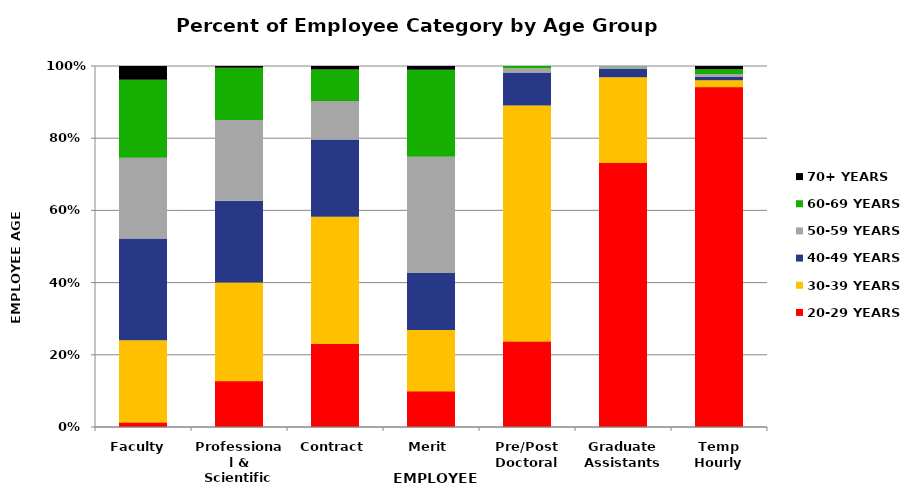
| Category | 20-29 YEARS | 30-39 YEARS | 40-49 YEARS | 50-59 YEARS | 60-69 YEARS | 70+ YEARS |
|---|---|---|---|---|---|---|
| Faculty  | 0.014 | 0.226 | 0.282 | 0.224 | 0.216 | 0.038 |
| Professional & Scientific | 0.13 | 0.27 | 0.227 | 0.224 | 0.144 | 0.005 |
| Contract | 0.233 | 0.35 | 0.214 | 0.107 | 0.087 | 0.01 |
| Merit | 0.101 | 0.168 | 0.158 | 0.321 | 0.241 | 0.011 |
| Pre/Post Doctoral | 0.239 | 0.652 | 0.091 | 0.012 | 0.006 | 0 |
| Graduate Assistants | 0.734 | 0.235 | 0.025 | 0.006 | 0.001 | 0 |
| Temp Hourly | 0.944 | 0.017 | 0.009 | 0.008 | 0.013 | 0.009 |